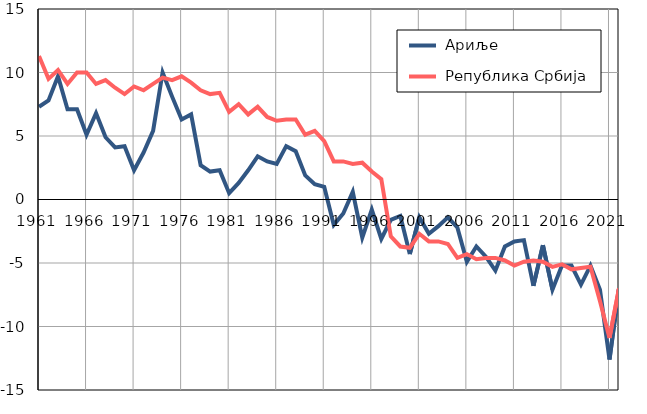
| Category |  Ариље |  Република Србија |
|---|---|---|
| 1961.0 | 7.3 | 11.3 |
| 1962.0 | 7.8 | 9.5 |
| 1963.0 | 9.7 | 10.2 |
| 1964.0 | 7.1 | 9.1 |
| 1965.0 | 7.1 | 10 |
| 1966.0 | 5.1 | 10 |
| 1967.0 | 6.8 | 9.1 |
| 1968.0 | 4.9 | 9.4 |
| 1969.0 | 4.1 | 8.8 |
| 1970.0 | 4.2 | 8.3 |
| 1971.0 | 2.3 | 8.9 |
| 1972.0 | 3.7 | 8.6 |
| 1973.0 | 5.4 | 9.1 |
| 1974.0 | 10 | 9.6 |
| 1975.0 | 8.1 | 9.4 |
| 1976.0 | 6.3 | 9.7 |
| 1977.0 | 6.7 | 9.2 |
| 1978.0 | 2.7 | 8.6 |
| 1979.0 | 2.2 | 8.3 |
| 1980.0 | 2.3 | 8.4 |
| 1981.0 | 0.5 | 6.9 |
| 1982.0 | 1.3 | 7.5 |
| 1983.0 | 2.3 | 6.7 |
| 1984.0 | 3.4 | 7.3 |
| 1985.0 | 3 | 6.5 |
| 1986.0 | 2.8 | 6.2 |
| 1987.0 | 4.2 | 6.3 |
| 1988.0 | 3.8 | 6.3 |
| 1989.0 | 1.9 | 5.1 |
| 1990.0 | 1.2 | 5.4 |
| 1991.0 | 1 | 4.6 |
| 1992.0 | -2 | 3 |
| 1993.0 | -1.1 | 3 |
| 1994.0 | 0.6 | 2.8 |
| 1995.0 | -3 | 2.9 |
| 1996.0 | -0.8 | 2.2 |
| 1997.0 | -3.1 | 1.6 |
| 1998.0 | -1.6 | -2.9 |
| 1999.0 | -1.3 | -3.7 |
| 2000.0 | -4.3 | -3.8 |
| 2001.0 | -1.4 | -2.7 |
| 2002.0 | -2.7 | -3.3 |
| 2003.0 | -2.1 | -3.3 |
| 2004.0 | -1.4 | -3.5 |
| 2005.0 | -2.2 | -4.6 |
| 2006.0 | -4.9 | -4.3 |
| 2007.0 | -3.7 | -4.7 |
| 2008.0 | -4.5 | -4.6 |
| 2009.0 | -5.6 | -4.6 |
| 2010.0 | -3.7 | -4.8 |
| 2011.0 | -3.3 | -5.2 |
| 2012.0 | -3.2 | -4.9 |
| 2013.0 | -6.8 | -4.8 |
| 2014.0 | -3.6 | -4.9 |
| 2015.0 | -7.1 | -5.3 |
| 2016.0 | -5.2 | -5.1 |
| 2017.0 | -5.2 | -5.5 |
| 2018.0 | -6.7 | -5.4 |
| 2019.0 | -5.2 | -5.3 |
| 2020.0 | -7.1 | -8 |
| 2021.0 | -12.6 | -10.9 |
| 2022.0 | -7 | -7 |